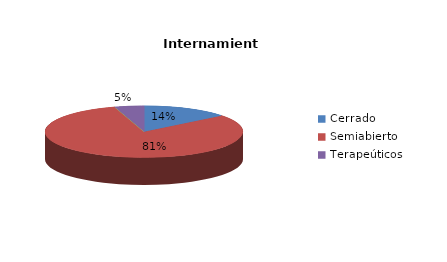
| Category | Series 0 |
|---|---|
| Cerrado | 3 |
| Semiabierto | 17 |
| Abierto | 0 |
| Terapeúticos | 1 |